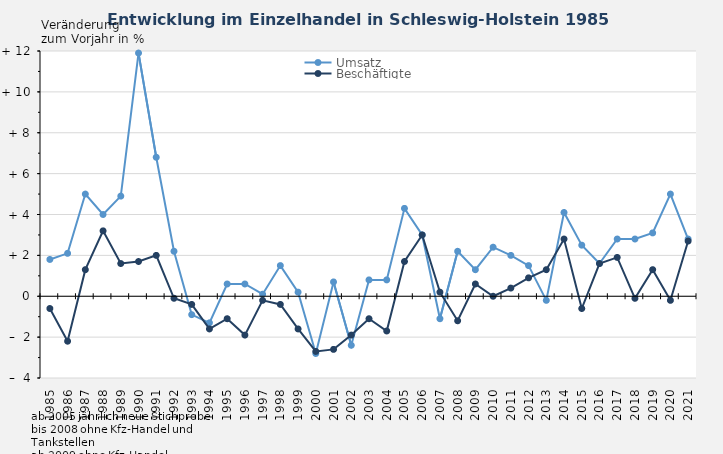
| Category | Umsatz | Beschäftigte |
|---|---|---|
| 1985.0 | 1.8 | -0.6 |
| 1986.0 | 2.1 | -2.2 |
| 1987.0 | 5 | 1.3 |
| 1988.0 | 4 | 3.2 |
| 1989.0 | 4.9 | 1.6 |
| 1990.0 | 11.9 | 1.7 |
| 1991.0 | 6.8 | 2 |
| 1992.0 | 2.2 | -0.1 |
| 1993.0 | -0.9 | -0.4 |
| 1994.0 | -1.3 | -1.6 |
| 1995.0 | 0.6 | -1.1 |
| 1996.0 | 0.6 | -1.9 |
| 1997.0 | 0.1 | -0.2 |
| 1998.0 | 1.5 | -0.4 |
| 1999.0 | 0.2 | -1.6 |
| 2000.0 | -2.8 | -2.7 |
| 2001.0 | 0.7 | -2.6 |
| 2002.0 | -2.4 | -1.9 |
| 2003.0 | 0.8 | -1.1 |
| 2004.0 | 0.8 | -1.7 |
| 2005.0 | 4.3 | 1.7 |
| 2006.0 | 3 | 3 |
| 2007.0 | -1.1 | 0.2 |
| 2008.0 | 2.2 | -1.2 |
| 2009.0 | 1.3 | 0.6 |
| 2010.0 | 2.4 | 0 |
| 2011.0 | 2 | 0.4 |
| 2012.0 | 1.5 | 0.9 |
| 2013.0 | -0.2 | 1.3 |
| 2014.0 | 4.1 | 2.8 |
| 2015.0 | 2.5 | -0.6 |
| 2016.0 | 1.6 | 1.6 |
| 2017.0 | 2.8 | 1.9 |
| 2018.0 | 2.8 | -0.1 |
| 2019.0 | 3.1 | 1.3 |
| 2020.0 | 5 | -0.2 |
| 2021.0 | 2.8 | 2.7 |